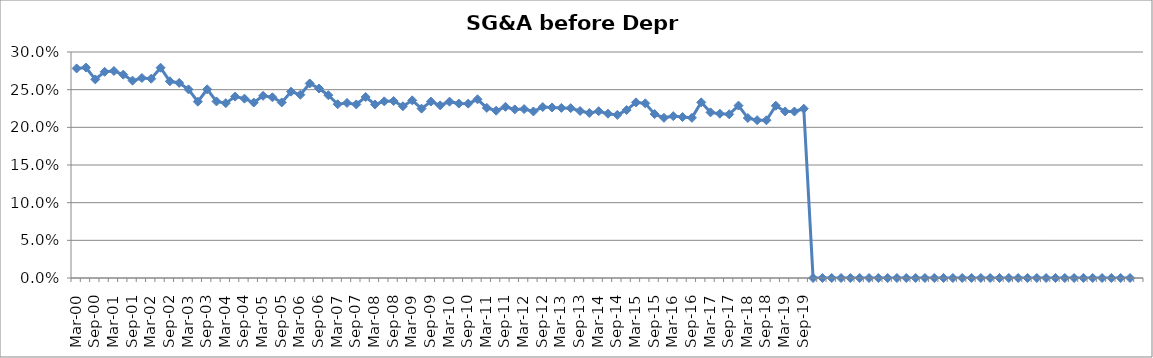
| Category | SG&A (before depr.) % |
|---|---|
| Mar-00 | 0.278 |
| Jun-00 | 0.279 |
| Sep-00 | 0.264 |
| Dec-00 | 0.274 |
| Mar-01 | 0.275 |
| Jun-01 | 0.27 |
| Sep-01 | 0.262 |
| Dec-01 | 0.265 |
| Mar-02 | 0.265 |
| Jun-02 | 0.279 |
| Sep-02 | 0.261 |
| Dec-02 | 0.259 |
| Mar-03 | 0.25 |
| Jun-03 | 0.234 |
| Sep-03 | 0.25 |
| Dec-03 | 0.234 |
| Mar-04 | 0.232 |
| Jun-04 | 0.241 |
| Sep-04 | 0.238 |
| Dec-04 | 0.233 |
| Mar-05 | 0.242 |
| Jun-05 | 0.24 |
| Sep-05 | 0.233 |
| Dec-05 | 0.247 |
| Mar-06 | 0.243 |
| Jun-06 | 0.258 |
| Sep-06 | 0.252 |
| Dec-06 | 0.243 |
| Mar-07 | 0.231 |
| Jun-07 | 0.232 |
| Sep-07 | 0.23 |
| Dec-07 | 0.24 |
| Mar-08 | 0.23 |
| Jun-08 | 0.234 |
| Sep-08 | 0.235 |
| Dec-08 | 0.228 |
| Mar-09 | 0.236 |
| Jun-09 | 0.225 |
| Sep-09 | 0.234 |
| Dec-09 | 0.229 |
| Mar-10 | 0.234 |
| Jun-10 | 0.232 |
| Sep-10 | 0.231 |
| Dec-10 | 0.237 |
| Mar-11 | 0.226 |
| Jun-11 | 0.222 |
| Sep-11 | 0.227 |
| Dec-11 | 0.224 |
| Mar-12 | 0.224 |
| Jun-12 | 0.221 |
| Sep-12 | 0.227 |
| Dec-12 | 0.226 |
| Mar-13 | 0.226 |
| Jun-13 | 0.225 |
| Sep-13 | 0.222 |
| Dec-13 | 0.219 |
| Mar-14 | 0.221 |
| Jun-14 | 0.218 |
| Sep-14 | 0.217 |
| Dec-14 | 0.223 |
| Mar-15 | 0.233 |
| Jun-15 | 0.232 |
| Sep-15 | 0.218 |
| Dec-15 | 0.213 |
| Mar-16 | 0.215 |
| Jun-16 | 0.214 |
| Sep-16 | 0.213 |
| Dec-16 | 0.233 |
| Mar-17 | 0.22 |
| Jun-17 | 0.218 |
| Sep-17 | 0.217 |
| Dec-17 | 0.229 |
| Mar-18 | 0.212 |
| Jun-18 | 0.21 |
| Sep-18 | 0.209 |
| Dec-18 | 0.229 |
| Mar-19 | 0.221 |
| Jun-19 | 0.221 |
| Sep-19 | 0.225 |